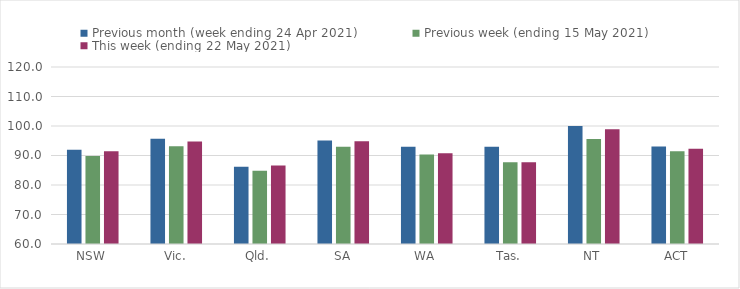
| Category | Previous month (week ending 24 Apr 2021) | Previous week (ending 15 May 2021) | This week (ending 22 May 2021) |
|---|---|---|---|
| NSW | 91.99 | 89.84 | 91.4 |
| Vic. | 95.7 | 93.12 | 94.78 |
| Qld. | 86.22 | 84.86 | 86.57 |
| SA | 95.12 | 92.96 | 94.86 |
| WA | 92.93 | 90.37 | 90.75 |
| Tas. | 92.96 | 87.67 | 87.74 |
| NT | 100 | 95.61 | 98.87 |
| ACT | 93.07 | 91.47 | 92.25 |